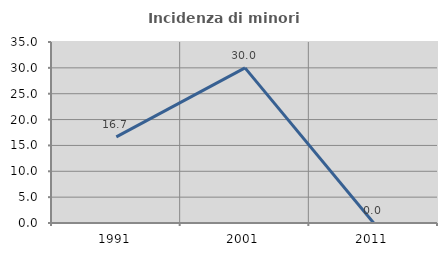
| Category | Incidenza di minori stranieri |
|---|---|
| 1991.0 | 16.667 |
| 2001.0 | 30 |
| 2011.0 | 0 |